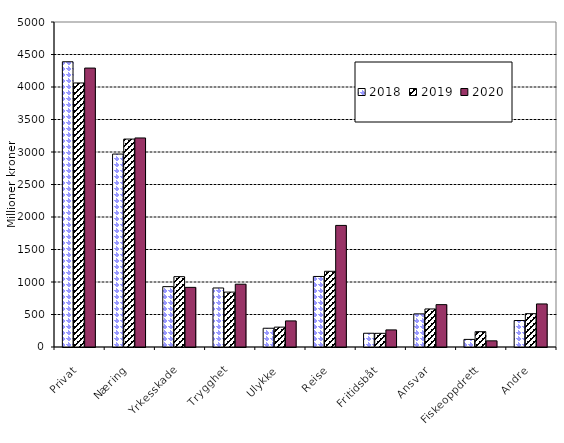
| Category | 2018 | 2019 | 2020 |
|---|---|---|---|
| Privat | 4388.265 | 4062.098 | 4291.207 |
| Næring | 2968.497 | 3198.952 | 3215.997 |
| Yrkesskade | 928.785 | 1082.429 | 917.481 |
| Trygghet | 908.027 | 844.528 | 966.103 |
| Ulykke | 288.488 | 305.606 | 401.426 |
| Reise | 1085.106 | 1164.677 | 1870.555 |
| Fritidsbåt | 211.627 | 210.512 | 262.931 |
| Ansvar | 509.757 | 585.276 | 651.869 |
| Fiskeoppdrett | 116.933 | 235.673 | 94.892 |
| Andre | 407.531 | 512.817 | 662.498 |